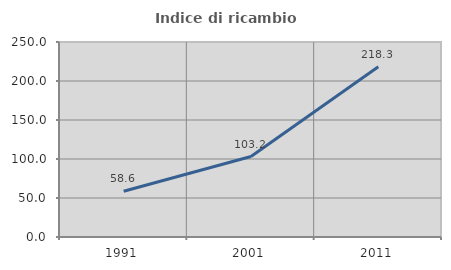
| Category | Indice di ricambio occupazionale  |
|---|---|
| 1991.0 | 58.631 |
| 2001.0 | 103.158 |
| 2011.0 | 218.349 |